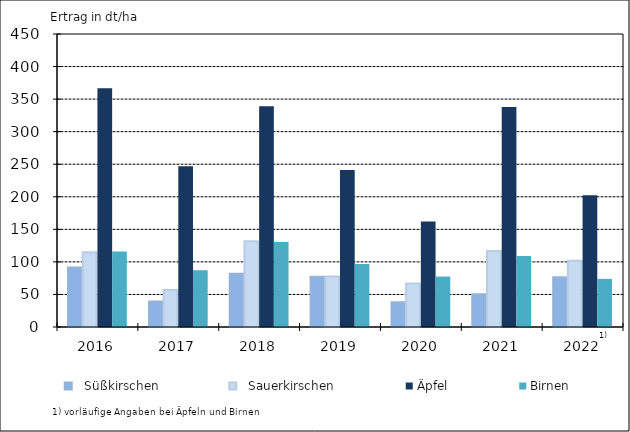
| Category |   Süßkirschen |   Sauerkirschen | Äpfel | Birnen |
|---|---|---|---|---|
| 2016.0 | 91.2 | 114.7 | 366.7 | 116 |
| 2017.0 | 39.1 | 56.7 | 246.9 | 87.2 |
| 2018.0 | 81.9 | 131.6 | 339.1 | 130.7 |
| 2019.0 | 77.2 | 77.7 | 241.3 | 96.8 |
| 2020.0 | 38 | 66.9 | 161.9 | 77.5 |
| 2021.0 | 50.2 | 116.8 | 337.8 | 108.9 |
| 2022.0 | 76.3 | 101.7 | 202.4 | 73.9 |